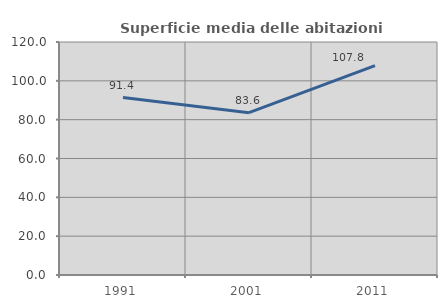
| Category | Superficie media delle abitazioni occupate |
|---|---|
| 1991.0 | 91.405 |
| 2001.0 | 83.592 |
| 2011.0 | 107.836 |